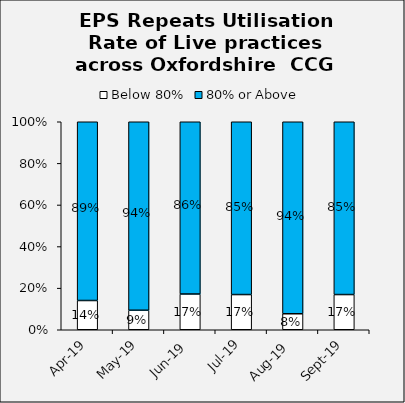
| Category | Below 80% | 80% or Above |
|---|---|---|
| 2019-04-01 | 0.141 | 0.891 |
| 2019-05-01 | 0.094 | 0.938 |
| 2019-06-01 | 0.172 | 0.859 |
| 2019-07-01 | 0.169 | 0.846 |
| 2019-08-01 | 0.077 | 0.938 |
| 2019-09-01 | 0.169 | 0.846 |